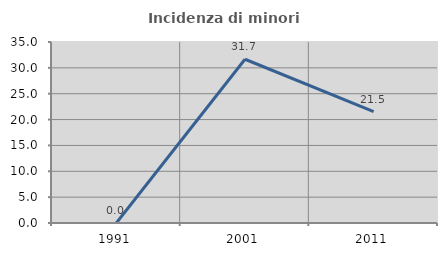
| Category | Incidenza di minori stranieri |
|---|---|
| 1991.0 | 0 |
| 2001.0 | 31.667 |
| 2011.0 | 21.528 |